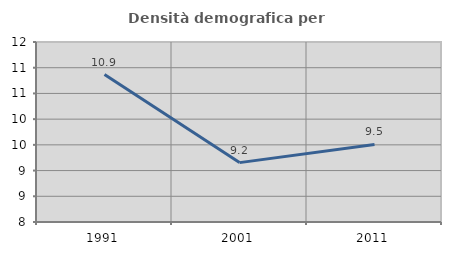
| Category | Densità demografica |
|---|---|
| 1991.0 | 10.868 |
| 2001.0 | 9.155 |
| 2011.0 | 9.509 |